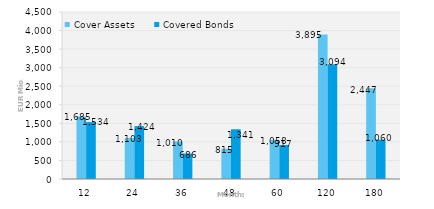
| Category | Cover Assets | Covered Bonds |
|---|---|---|
| 12.0 | 1685.35 | 1534.101 |
| 24.0 | 1103.054 | 1424.427 |
| 36.0 | 1010.419 | 686.1 |
| 48.0 | 814.538 | 1340.613 |
| 60.0 | 1058.438 | 916.942 |
| 120.0 | 3895.469 | 3094 |
| 180.0 | 2446.881 | 1059.568 |